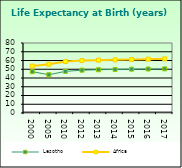
| Category | Lesotho | Africa                        |
|---|---|---|
| 2000.0 | 47.265 | 53.721 |
| 2005.0 | 43.724 | 55.757 |
| 2010.0 | 47.584 | 58.857 |
| 2012.0 | 48.947 | 59.91 |
| 2013.0 | 49.446 | 60.376 |
| 2014.0 | 49.818 | 60.801 |
| 2015.0 | 50.08 | 61.187 |
| 2016.0 | 50.272 | 61.538 |
| 2017.0 | 50.453 | 61.865 |